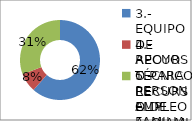
| Category | Series 0 |
|---|---|
| 3.- EQUIPO DE APOYO TÉCNICO PERSONAL Y FAMILIAR PARA LA INCLUSIÓN SOCIAL | 8 |
| 4.- RECURSO PARA EL EMPLEO | 1 |
| 5.- RECURSO DE ALOJAMIENTO PARA LA
INCLUSIÓN | 4 |